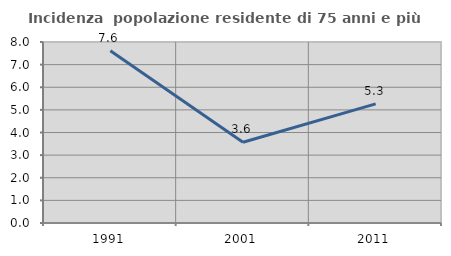
| Category | Incidenza  popolazione residente di 75 anni e più |
|---|---|
| 1991.0 | 7.609 |
| 2001.0 | 3.571 |
| 2011.0 | 5.263 |